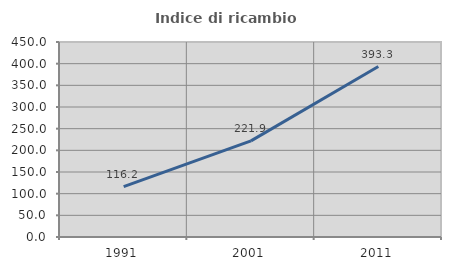
| Category | Indice di ricambio occupazionale  |
|---|---|
| 1991.0 | 116.216 |
| 2001.0 | 221.875 |
| 2011.0 | 393.333 |